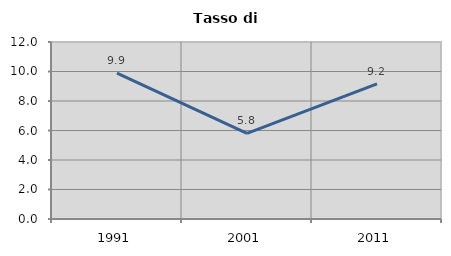
| Category | Tasso di disoccupazione   |
|---|---|
| 1991.0 | 9.893 |
| 2001.0 | 5.802 |
| 2011.0 | 9.159 |